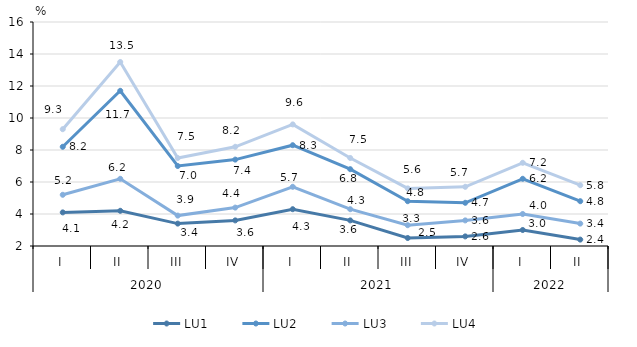
| Category | LU1 | LU2 | LU3 | LU4 |
|---|---|---|---|---|
| 0 | 4.1 | 8.2 | 5.2 | 9.3 |
| 1 | 4.2 | 11.7 | 6.2 | 13.5 |
| 2 | 3.4 | 7 | 3.9 | 7.5 |
| 3 | 3.6 | 7.4 | 4.4 | 8.2 |
| 4 | 4.3 | 8.3 | 5.7 | 9.6 |
| 5 | 3.6 | 6.8 | 4.3 | 7.5 |
| 6 | 2.5 | 4.8 | 3.3 | 5.6 |
| 7 | 2.6 | 4.7 | 3.6 | 5.7 |
| 8 | 3 | 6.2 | 4 | 7.2 |
| 9 | 2.4 | 4.8 | 3.4 | 5.8 |